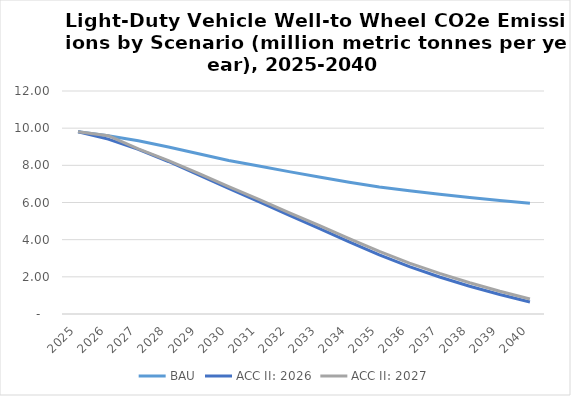
| Category | BAU | ACC II: 2026 | ACC II: 2027 |
|---|---|---|---|
| 2025.0 | 9.809 | 9.809 | 9.809 |
| 2026.0 | 9.596 | 9.409 | 9.596 |
| 2027.0 | 9.321 | 8.858 | 8.883 |
| 2028.0 | 8.988 | 8.206 | 8.255 |
| 2029.0 | 8.619 | 7.493 | 7.565 |
| 2030.0 | 8.26 | 6.765 | 6.86 |
| 2031.0 | 7.959 | 6.046 | 6.167 |
| 2032.0 | 7.661 | 5.317 | 5.46 |
| 2033.0 | 7.372 | 4.605 | 4.767 |
| 2034.0 | 7.093 | 3.883 | 4.06 |
| 2035.0 | 6.829 | 3.182 | 3.37 |
| 2036.0 | 6.629 | 2.548 | 2.742 |
| 2037.0 | 6.444 | 1.99 | 2.183 |
| 2038.0 | 6.272 | 1.492 | 1.68 |
| 2039.0 | 6.112 | 1.046 | 1.223 |
| 2040.0 | 5.965 | 0.648 | 0.808 |